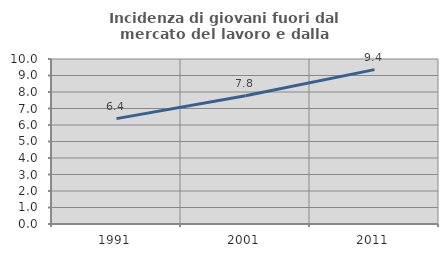
| Category | Incidenza di giovani fuori dal mercato del lavoro e dalla formazione  |
|---|---|
| 1991.0 | 6.385 |
| 2001.0 | 7.775 |
| 2011.0 | 9.355 |